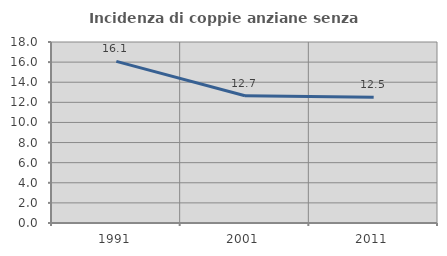
| Category | Incidenza di coppie anziane senza figli  |
|---|---|
| 1991.0 | 16.071 |
| 2001.0 | 12.651 |
| 2011.0 | 12.506 |